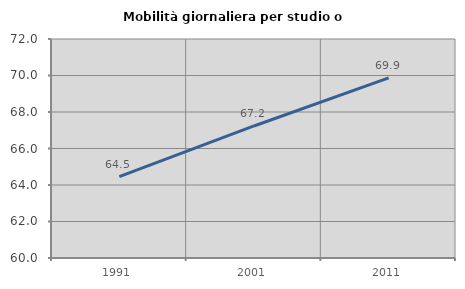
| Category | Mobilità giornaliera per studio o lavoro |
|---|---|
| 1991.0 | 64.455 |
| 2001.0 | 67.235 |
| 2011.0 | 69.87 |